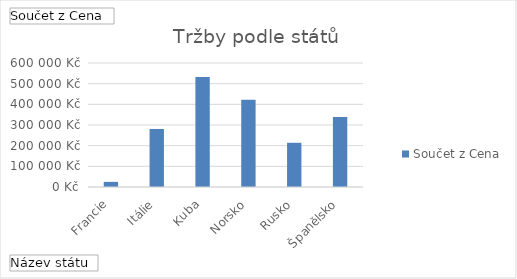
| Category | Celkem |
|---|---|
| Francie | 24800 |
| Itálie | 280800 |
| Kuba | 532000 |
| Norsko | 421800 |
| Rusko | 213900 |
| Španělsko | 338700 |